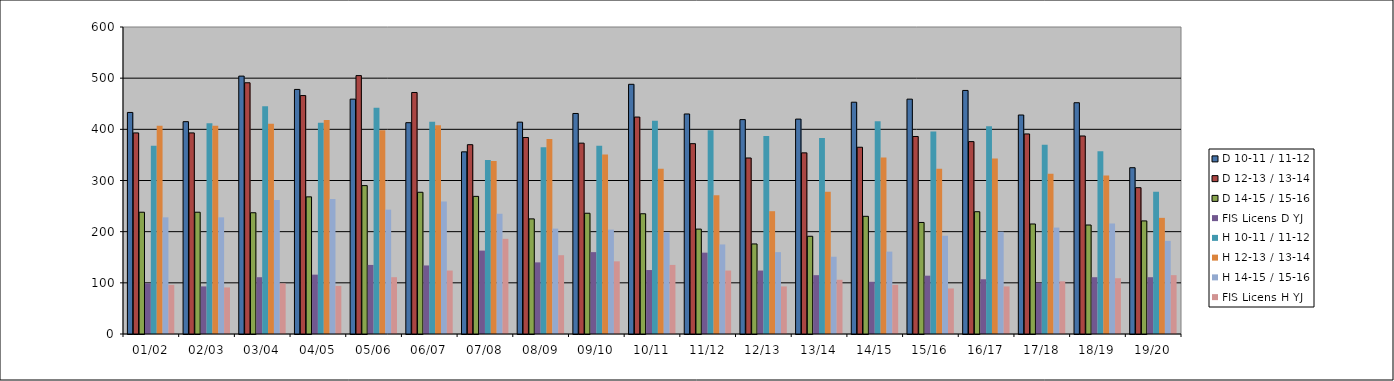
| Category | D 10-11 / 11-12 | D 12-13 / 13-14 | D 14-15 / 15-16 | FIS Licens D YJ | H 10-11 / 11-12 | H 12-13 / 13-14 | H 14-15 / 15-16 | FIS Licens H YJ |
|---|---|---|---|---|---|---|---|---|
| 01/02 | 433 | 393 | 238 | 99 | 368 | 407 | 228 | 96 |
| 02/03 | 415 | 393 | 238 | 93 | 412 | 407 | 228 | 91 |
| 03/04 | 504 | 491 | 237 | 111 | 445 | 411 | 262 | 99 |
| 04/05 | 478 | 466 | 268 | 116 | 413 | 418 | 264 | 94 |
| 05/06 | 459 | 505 | 290 | 135 | 442 | 398 | 243 | 111 |
| 06/07 | 413 | 472 | 277 | 134 | 415 | 408 | 259 | 124 |
| 07/08 | 356 | 370 | 269 | 163 | 340 | 338 | 235 | 186 |
| 08/09 | 414 | 384 | 225 | 140 | 365 | 381 | 206 | 154 |
| 09/10 | 431 | 373 | 236 | 160 | 368 | 351 | 204 | 142 |
| 10/11 | 488 | 424 | 235 | 125 | 417 | 323 | 199 | 135 |
| 11/12 | 430 | 372 | 205 | 159 | 398 | 271 | 175 | 124 |
| 12/13 | 419 | 344 | 176 | 124 | 387 | 240 | 160 | 93 |
| 13/14 | 420 | 354 | 191 | 115 | 383 | 278 | 151 | 106 |
| 14/15 | 453 | 365 | 230 | 102 | 416 | 345 | 161 | 96 |
| 15/16 | 459 | 386 | 218 | 114 | 396 | 323 | 192 | 89 |
| 16/17 | 476 | 376 | 239 | 107 | 406 | 343 | 200 | 93 |
| 17/18 | 428 | 391 | 215 | 100 | 370 | 313 | 208 | 103 |
| 18/19 | 452 | 387 | 213 | 111 | 357 | 310 | 216 | 109 |
| 19/20 | 325 | 286 | 221 | 111 | 278 | 227 | 182 | 115 |